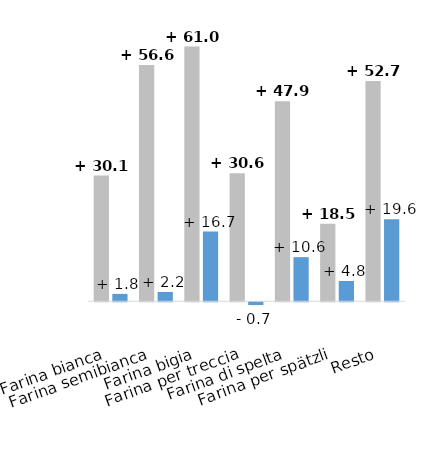
| Category | in % |
|---|---|
| Farina bianca | 1.763 |
| Farina semibianca | 2.235 |
| Farina bigia | 16.696 |
| Farina per treccia | -0.684 |
| Farina di spelta | 10.564 |
| Farina per spätzli | 4.845 |
| Resto | 19.641 |